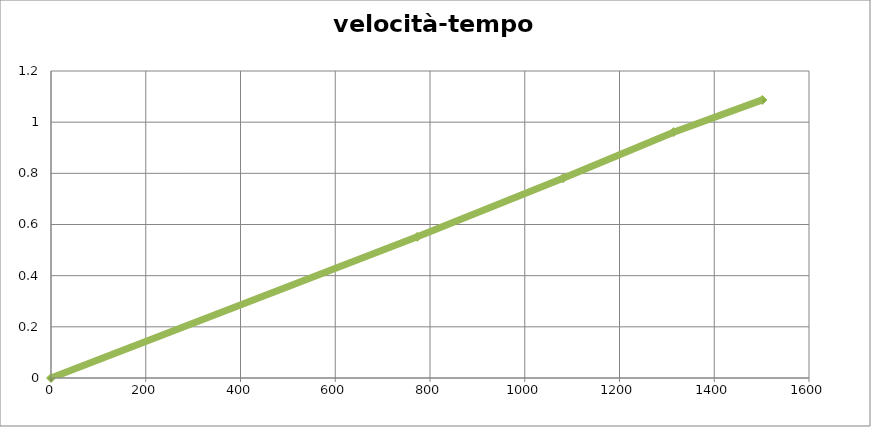
| Category | velocita tempo |
|---|---|
| 0.0 | 0 |
| 773.1555555555556 | 0.552 |
| 1080.7900000000002 | 0.781 |
| 1314.1799999999998 | 0.961 |
| 1501.5800000000002 | 1.087 |